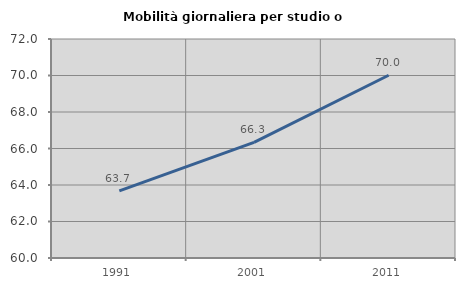
| Category | Mobilità giornaliera per studio o lavoro |
|---|---|
| 1991.0 | 63.679 |
| 2001.0 | 66.334 |
| 2011.0 | 70.012 |